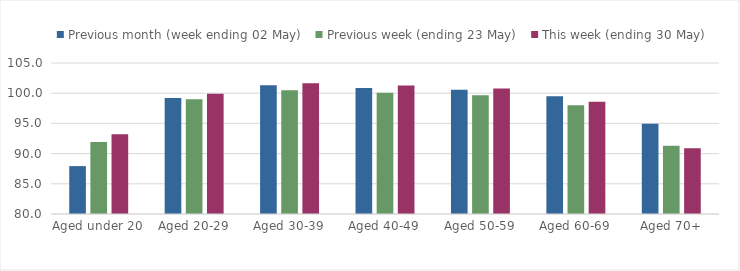
| Category | Previous month (week ending 02 May) | Previous week (ending 23 May) | This week (ending 30 May) |
|---|---|---|---|
| Aged under 20 | 87.93 | 91.935 | 93.217 |
| Aged 20-29 | 99.209 | 98.984 | 99.893 |
| Aged 30-39 | 101.312 | 100.477 | 101.632 |
| Aged 40-49 | 100.858 | 100.087 | 101.269 |
| Aged 50-59 | 100.564 | 99.649 | 100.76 |
| Aged 60-69 | 99.475 | 97.99 | 98.591 |
| Aged 70+ | 94.939 | 91.281 | 90.9 |